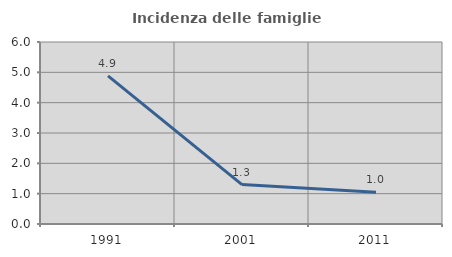
| Category | Incidenza delle famiglie numerose |
|---|---|
| 1991.0 | 4.884 |
| 2001.0 | 1.3 |
| 2011.0 | 1.044 |